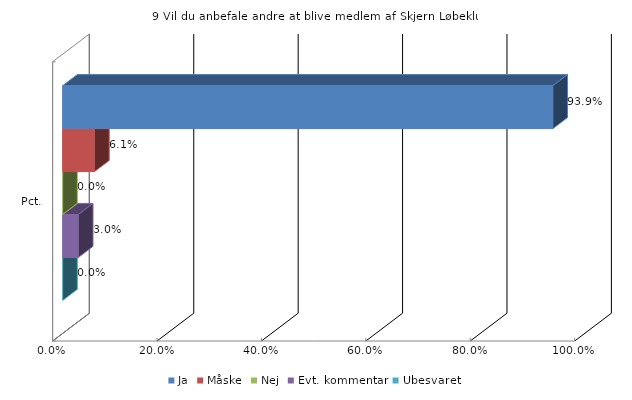
| Category | Ja | Måske | Nej | Evt. kommentar | Ubesvaret |
|---|---|---|---|---|---|
| Pct. | 0.939 | 0.061 | 0 | 0.03 | 0 |